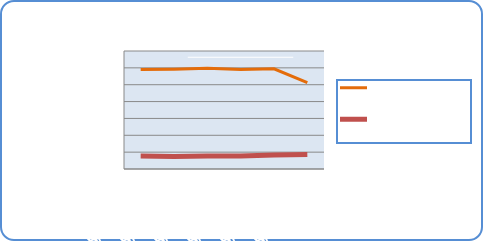
| Category | Motorin Türleri  | Benzin Türleri |
|---|---|---|
| 5/21/18 | 58956338.304 | 7689248.511 |
| 5/22/18 | 59169237.921 | 7433448.129 |
| 5/23/18 | 59710569.447 | 7730315.114 |
| 5/24/18 | 59082244.956 | 7646896.354 |
| 5/25/18 | 59468815.354 | 8246996.045 |
| 5/26/18 | 51219613.362 | 8542419.222 |